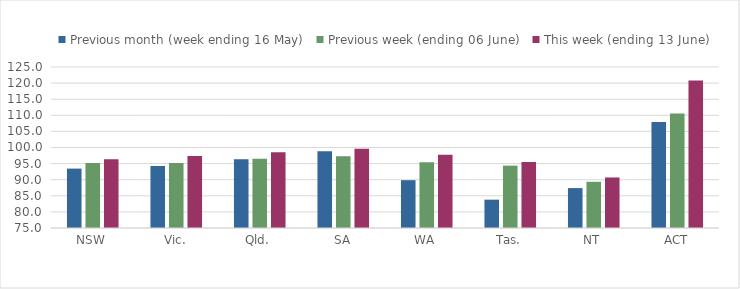
| Category | Previous month (week ending 16 May) | Previous week (ending 06 June) | This week (ending 13 June) |
|---|---|---|---|
| NSW | 93.445 | 95.149 | 96.315 |
| Vic. | 94.264 | 95.191 | 97.331 |
| Qld. | 96.341 | 96.51 | 98.506 |
| SA | 98.818 | 97.299 | 99.589 |
| WA | 89.845 | 95.441 | 97.731 |
| Tas. | 83.803 | 94.366 | 95.535 |
| NT | 87.391 | 89.348 | 90.691 |
| ACT | 107.895 | 110.526 | 120.789 |